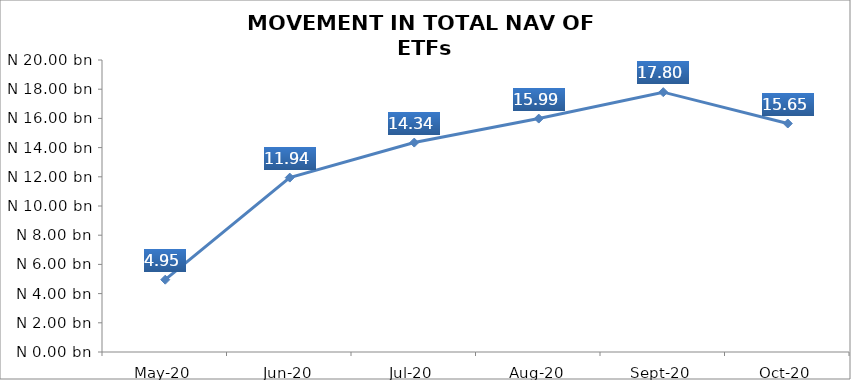
| Category | Series 0 |
|---|---|
| 2020-05-01 | 4952411842.71 |
| 2020-06-01 | 11944935776.22 |
| 2020-07-01 | 14343728259.45 |
| 2020-08-01 | 15987397591.7 |
| 2020-09-01 | 17796594275.01 |
| 2020-10-01 | 15650550930.52 |